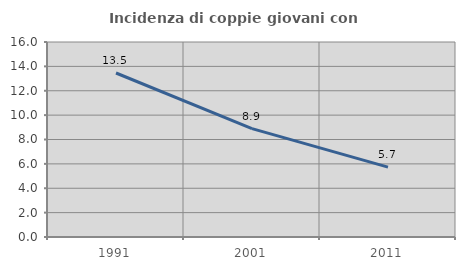
| Category | Incidenza di coppie giovani con figli |
|---|---|
| 1991.0 | 13.455 |
| 2001.0 | 8.892 |
| 2011.0 | 5.738 |